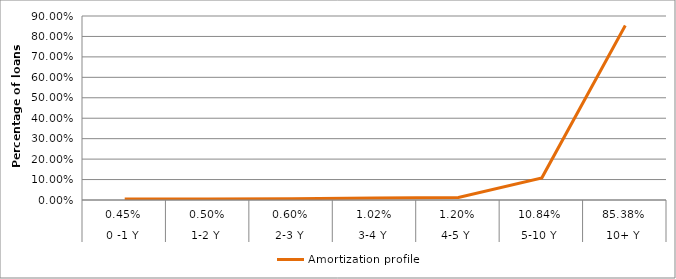
| Category | Amortization profile |
|---|---|
| 0 | 0.004 |
| 1 | 0.005 |
| 2 | 0.006 |
| 3 | 0.01 |
| 4 | 0.012 |
| 5 | 0.108 |
| 6 | 0.854 |